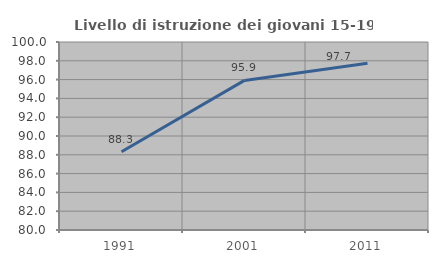
| Category | Livello di istruzione dei giovani 15-19 anni |
|---|---|
| 1991.0 | 88.324 |
| 2001.0 | 95.914 |
| 2011.0 | 97.732 |